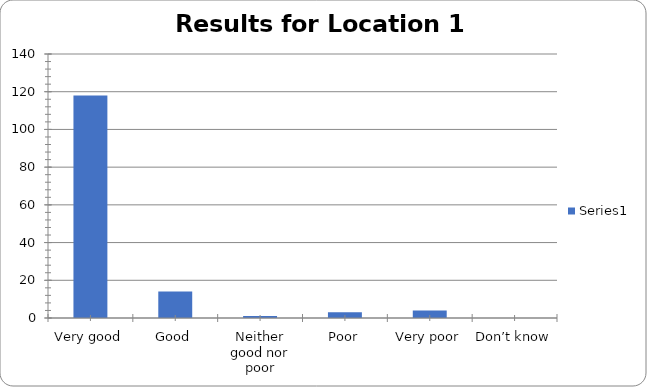
| Category | Series 0 |
|---|---|
| Very good | 118 |
| Good | 14 |
| Neither good nor poor | 1 |
| Poor | 3 |
| Very poor | 4 |
| Don’t know | 0 |